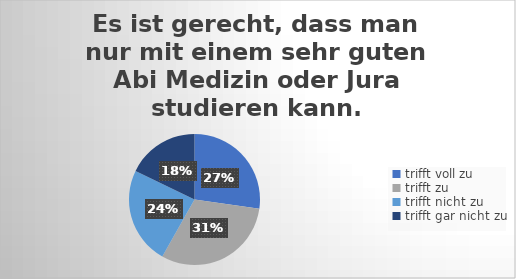
| Category | Es ist gerecht, dass man nur mit einem sehr guten Abi Medizin oder Jura studieren kann. |
|---|---|
| trifft voll zu | 75 |
| trifft zu  | 85 |
| trifft nicht zu  | 66 |
| trifft gar nicht zu | 49 |